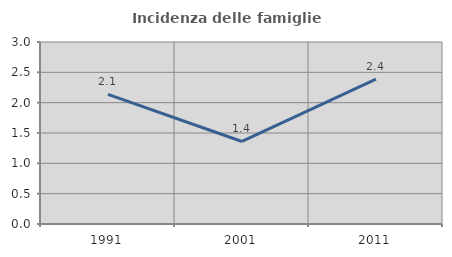
| Category | Incidenza delle famiglie numerose |
|---|---|
| 1991.0 | 2.138 |
| 2001.0 | 1.36 |
| 2011.0 | 2.39 |